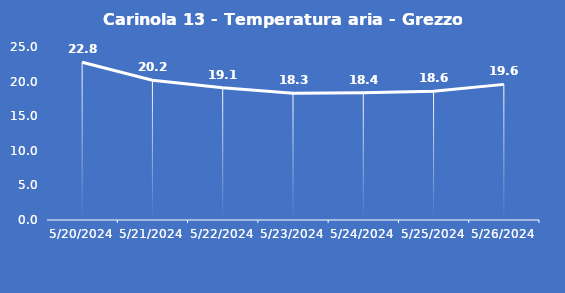
| Category | Carinola 13 - Temperatura aria - Grezzo (°C) |
|---|---|
| 5/20/24 | 22.8 |
| 5/21/24 | 20.2 |
| 5/22/24 | 19.1 |
| 5/23/24 | 18.3 |
| 5/24/24 | 18.4 |
| 5/25/24 | 18.6 |
| 5/26/24 | 19.6 |